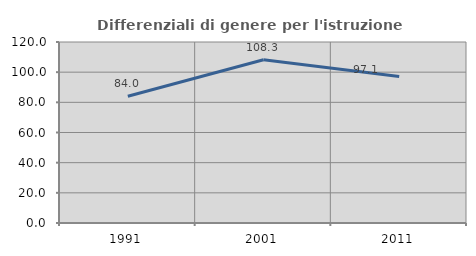
| Category | Differenziali di genere per l'istruzione superiore |
|---|---|
| 1991.0 | 84.038 |
| 2001.0 | 108.265 |
| 2011.0 | 97.066 |